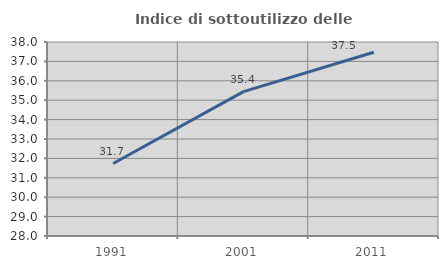
| Category | Indice di sottoutilizzo delle abitazioni  |
|---|---|
| 1991.0 | 31.737 |
| 2001.0 | 35.442 |
| 2011.0 | 37.473 |